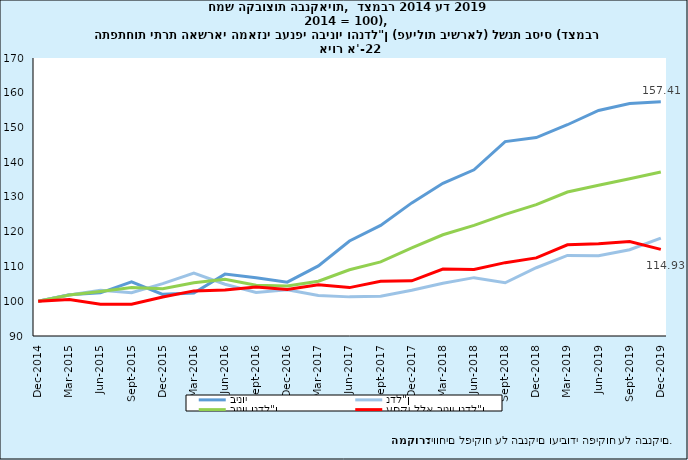
| Category | בינוי | נדל"ן | בינוי ונדל"ן  | עסקי ללא בינוי ונדל"ן |
|---|---|---|---|---|
| 2014-12-31 | 100 | 100 | 100 | 100 |
| 2015-03-31 | 101.838 | 101.796 | 101.816 | 100.487 |
| 2015-06-30 | 102.411 | 103.19 | 102.812 | 99.159 |
| 2015-09-30 | 105.613 | 102.443 | 103.981 | 99.128 |
| 2015-12-31 | 101.979 | 105.089 | 103.581 | 101.247 |
| 2016-03-31 | 102.366 | 108.081 | 105.309 | 102.979 |
| 2016-06-30 | 107.811 | 104.881 | 106.302 | 103.247 |
| 2016-09-30 | 106.778 | 102.512 | 104.581 | 104.072 |
| 2016-12-31 | 105.496 | 103.315 | 104.373 | 103.379 |
| 2017-03-31 | 110.16 | 101.634 | 105.769 | 104.751 |
| 2017-06-30 | 117.351 | 101.259 | 109.064 | 103.927 |
| 2017-09-30 | 121.834 | 101.454 | 111.339 | 105.764 |
| 2017-12-31 | 128.306 | 103.162 | 115.358 | 105.88 |
| 2018-03-31 | 133.941 | 105.18 | 119.13 | 109.281 |
| 2018-06-30 | 137.839 | 106.792 | 121.851 | 109.169 |
| 2018-09-30 | 145.939 | 105.309 | 125.016 | 111.107 |
| 2018-12-31 | 147.105 | 109.642 | 127.813 | 112.475 |
| 2019-03-31 | 150.793 | 113.183 | 131.425 | 116.248 |
| 2019-06-30 | 154.917 | 113.066 | 133.365 | 116.549 |
| 2019-09-30 | 156.886 | 114.839 | 135.233 | 117.215 |
| 2019-12-31 | 157.406 | 118.168 | 137.2 | 114.925 |